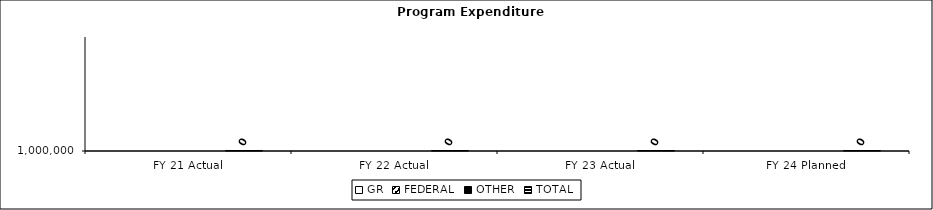
| Category | GR | FEDERAL | OTHER | TOTAL |
|---|---|---|---|---|
| FY 21 Actual |  |  |  | 0 |
| FY 22 Actual |  |  |  | 0 |
| FY 23 Actual |  |  |  | 0 |
| FY 24 Planned |  |  |  | 0 |